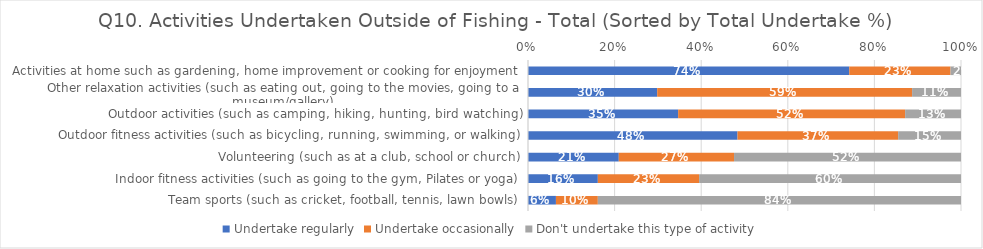
| Category | Undertake regularly | Undertake occasionally | Don't undertake this type of activity |
|---|---|---|---|
| Activities at home such as gardening, home improvement or cooking for enjoyment | 0.742 | 0.234 | 0.024 |
| Other relaxation activities (such as eating out, going to the movies, going to a museum/gallery) | 0.298 | 0.589 | 0.113 |
| Outdoor activities (such as camping, hiking, hunting, bird watching) | 0.347 | 0.524 | 0.129 |
| Outdoor fitness activities (such as bicycling, running, swimming, or walking) | 0.484 | 0.371 | 0.145 |
| Volunteering (such as at a club, school or church) | 0.21 | 0.266 | 0.524 |
| Indoor fitness activities (such as going to the gym, Pilates or yoga) | 0.161 | 0.234 | 0.605 |
| Team sports (such as cricket, football, tennis, lawn bowls) | 0.065 | 0.097 | 0.839 |